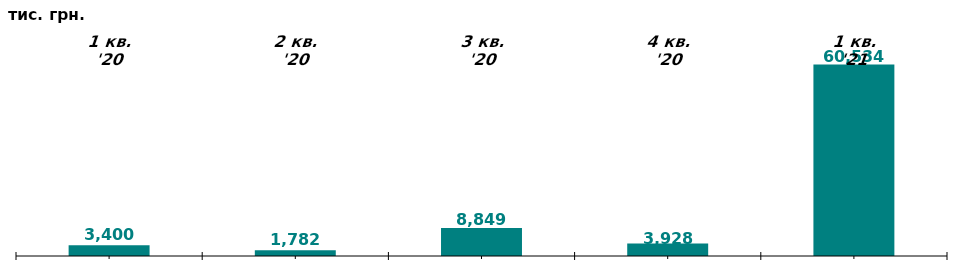
| Category | Чистий притік/відтік капіталу у 1-му кв. 2020-21 рр, тис. грн |
|---|---|
| 1 кв. '20 | 3400.023 |
| 2 кв. '20 | 1781.633 |
| 3 кв. '20 | 8849.263 |
| 4 кв. '20 | 3928.167 |
| 1 кв. '21 | 60533.895 |